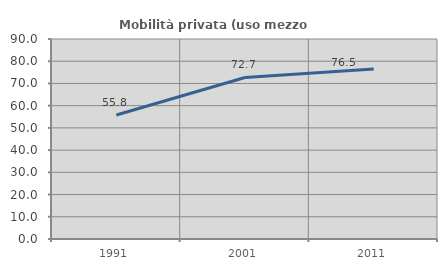
| Category | Mobilità privata (uso mezzo privato) |
|---|---|
| 1991.0 | 55.788 |
| 2001.0 | 72.703 |
| 2011.0 | 76.496 |